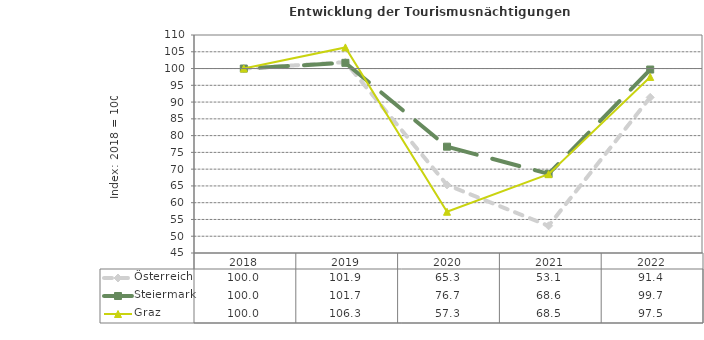
| Category | Österreich | Steiermark | Graz |
|---|---|---|---|
| 2022.0 | 91.4 | 99.7 | 97.5 |
| 2021.0 | 53.1 | 68.6 | 68.5 |
| 2020.0 | 65.3 | 76.7 | 57.3 |
| 2019.0 | 101.9 | 101.7 | 106.3 |
| 2018.0 | 100 | 100 | 100 |